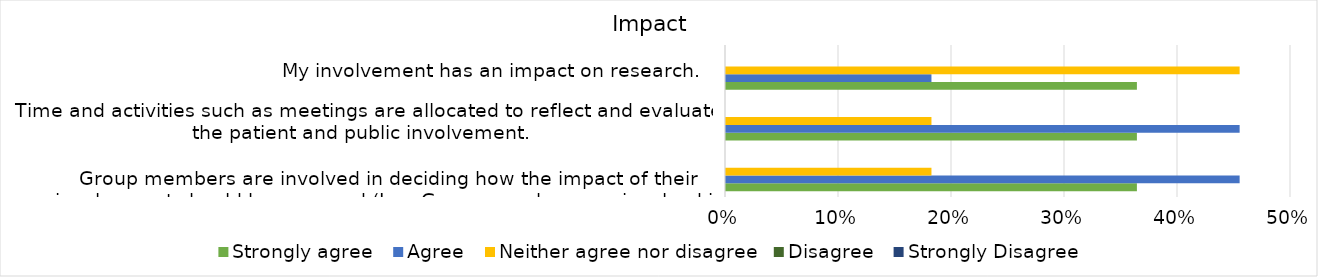
| Category | Strongly agree
 | Agree
 | Neither agree nor disagree
 | Disagree
 | Strongly Disagree 
 |
|---|---|---|---|---|---|
| 
Group members are involved in deciding how the impact of their involvement should be assessed (I.e., Group members are involved in deciding how to evaluate the progress and impact of the group). 
 | 0.364 | 0.455 | 0.182 | 0 | 0 |
| Time and activities such as meetings are allocated to reflect and evaluate the patient and public involvement. 
 | 0.364 | 0.455 | 0.182 | 0 | 0 |
| My involvement has an impact on research. 
 | 0.364 | 0.182 | 0.455 | 0 | 0 |